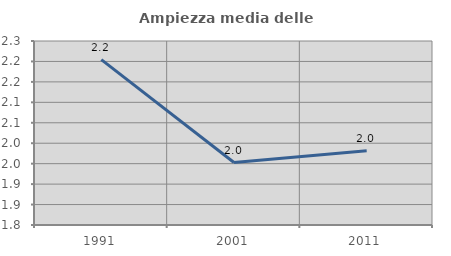
| Category | Ampiezza media delle famiglie |
|---|---|
| 1991.0 | 2.204 |
| 2001.0 | 1.953 |
| 2011.0 | 1.981 |